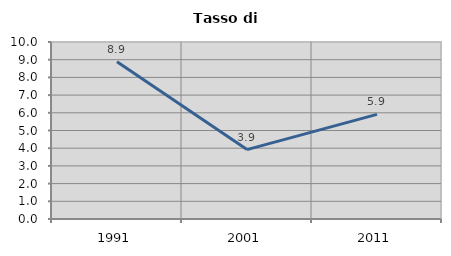
| Category | Tasso di disoccupazione   |
|---|---|
| 1991.0 | 8.886 |
| 2001.0 | 3.922 |
| 2011.0 | 5.911 |